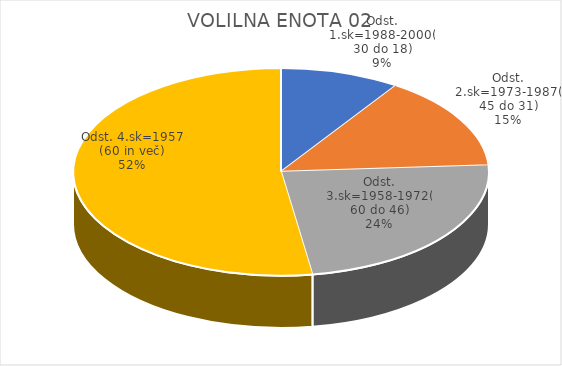
| Category | VOLILNA ENOTA 02 |
|---|---|
| Odst. 1.sk=1988-2000(30 do 18) | 1.55 |
| Odst. 2.sk=1973-1987(45 do 31) | 2.43 |
| Odst. 3.sk=1958-1972(60 do 46) | 3.92 |
| Odst. 4.sk=1957 (60 in več) | 8.7 |